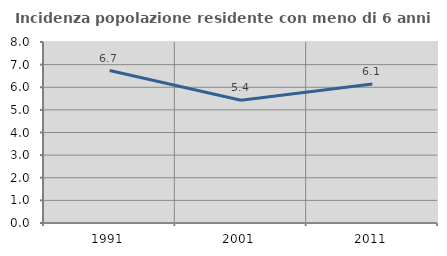
| Category | Incidenza popolazione residente con meno di 6 anni |
|---|---|
| 1991.0 | 6.74 |
| 2001.0 | 5.424 |
| 2011.0 | 6.144 |